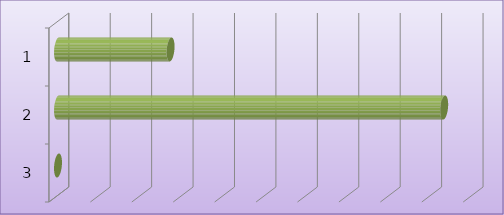
| Category | Series 0 |
|---|---|
| 0 | 13587540 |
| 1 | 46612731 |
| 2 | 0 |